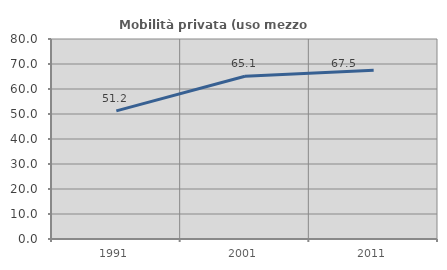
| Category | Mobilità privata (uso mezzo privato) |
|---|---|
| 1991.0 | 51.238 |
| 2001.0 | 65.111 |
| 2011.0 | 67.521 |